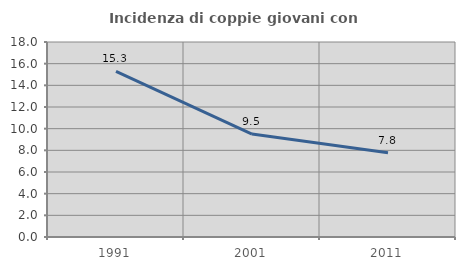
| Category | Incidenza di coppie giovani con figli |
|---|---|
| 1991.0 | 15.291 |
| 2001.0 | 9.506 |
| 2011.0 | 7.767 |